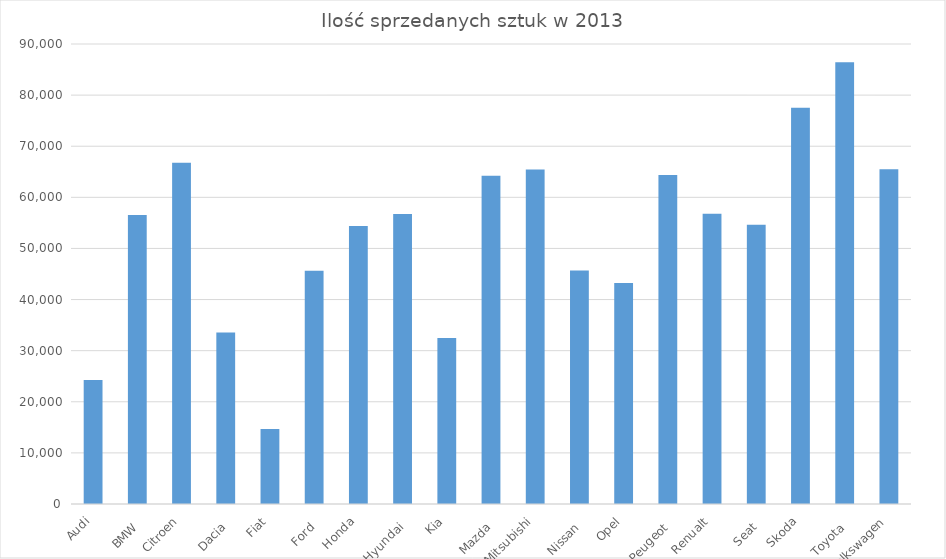
| Category | Ilość sprzedanych sztuk w 2013 |
|---|---|
| Audi | 24245 |
| 
BMW | 56567 |
| Citroen | 66778 |
| 
Dacia | 33563 |
| Fiat | 14673 |
| 
Ford | 45632 |
| Honda | 54367 |
| 
Hyundai | 56743 |
| Kia | 32456 |
| 
Mazda | 64245 |
| Mitsubishi | 65432 |
| 
Nissan | 45678 |
| Opel | 43225 |
| 
Peugeot | 64367 |
| Renualt | 56786 |
| 
Seat | 54632 |
| Skoda | 77543 |
| 
Toyota | 86432 |
| Volkswagen | 65478 |